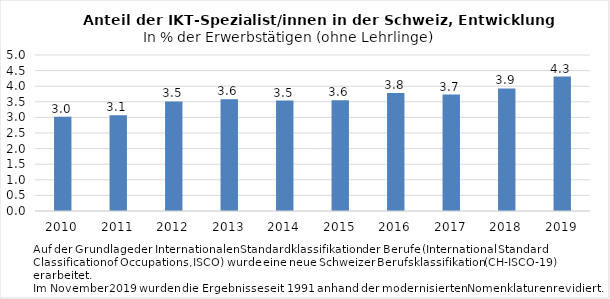
| Category | %  |
|---|---|
| 2010.0 | 3.02 |
| 2011.0 | 3.07 |
| 2012.0 | 3.51 |
| 2013.0 | 3.58 |
| 2014.0 | 3.54 |
| 2015.0 | 3.55 |
| 2016.0 | 3.78 |
| 2017.0 | 3.73 |
| 2018.0 | 3.93 |
| 2019.0 | 4.31 |